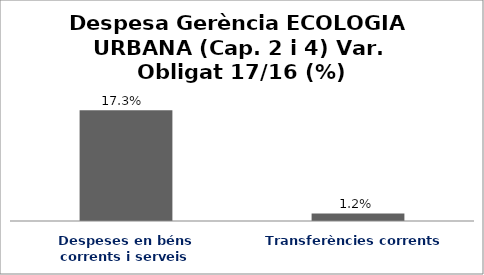
| Category | Series 0 |
|---|---|
| Despeses en béns corrents i serveis | 0.173 |
| Transferències corrents | 0.012 |